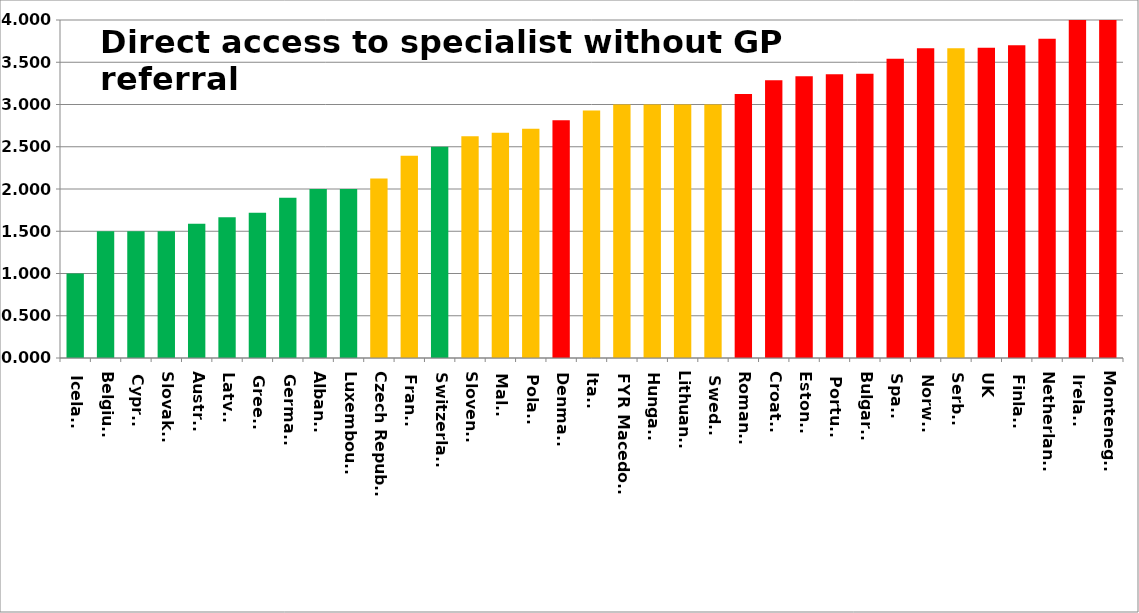
| Category | Series 0 |
|---|---|
| Iceland | 1 |
| Belgium | 1.5 |
| Cyprus | 1.5 |
| Slovakia | 1.5 |
| Austria | 1.588 |
| Latvia | 1.667 |
| Greece | 1.72 |
| Germany | 1.897 |
| Albania | 2 |
| Luxembourg | 2 |
| Czech Republic | 2.125 |
| France | 2.393 |
| Switzerland | 2.5 |
| Slovenia | 2.625 |
| Malta | 2.667 |
| Poland | 2.714 |
| Denmark | 2.812 |
| Italy | 2.93 |
| FYR Macedonia | 3 |
| Hungary | 3 |
| Lithuania | 3 |
| Sweden | 3 |
| Romania | 3.125 |
| Croatia | 3.286 |
| Estonia | 3.333 |
| Portugal | 3.357 |
| Bulgaria | 3.364 |
| Spain | 3.542 |
| Norway | 3.667 |
| Serbia | 3.667 |
| UK | 3.671 |
| Finland | 3.7 |
| Netherlands | 3.778 |
| Ireland | 4 |
| Montenegro | 4 |